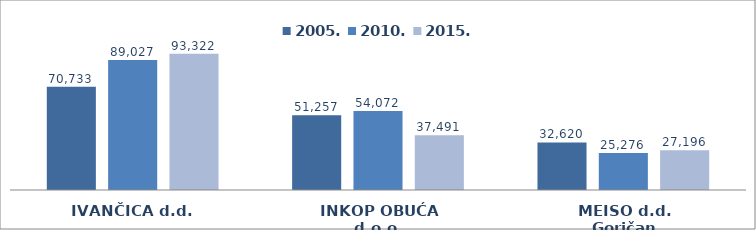
| Category | 2005. | 2010. | 2015. |
|---|---|---|---|
| IVANČICA d.d. | 70732.966 | 89026.585 | 93322.324 |
| INKOP OBUĆA d.o.o. | 51257.06 | 54071.866 | 37491.085 |
| MEISO d.d. Goričan | 32619.574 | 25276.061 | 27195.859 |